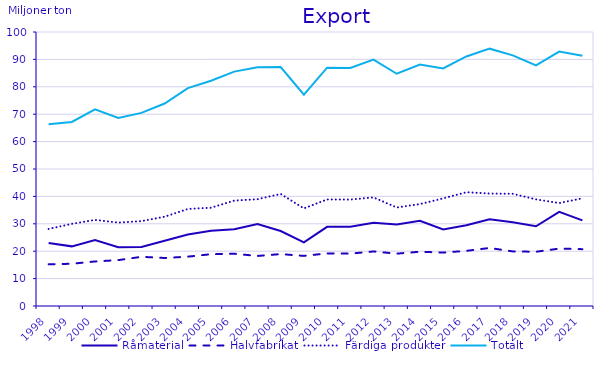
| Category | Råmaterial | Halvfabrikat | Färdiga produkter | Totalt |
|---|---|---|---|---|
| 1998.0 | 23.014 | 15.225 | 28.118 | 66.356 |
| 1999.0 | 21.768 | 15.418 | 29.983 | 67.169 |
| 2000.0 | 24.092 | 16.259 | 31.435 | 71.786 |
| 2001.0 | 21.458 | 16.744 | 30.44 | 68.642 |
| 2002.0 | 21.553 | 17.952 | 30.983 | 70.488 |
| 2003.0 | 23.794 | 17.523 | 32.59 | 73.906 |
| 2004.0 | 26.099 | 18.01 | 35.421 | 79.53 |
| 2005.0 | 27.44 | 18.905 | 35.877 | 82.222 |
| 2006.0 | 28.008 | 19.074 | 38.469 | 85.551 |
| 2007.0 | 29.901 | 18.267 | 38.976 | 87.144 |
| 2008.0 | 27.364 | 18.951 | 40.893 | 87.208 |
| 2009.0 | 23.233 | 18.287 | 35.626 | 77.145 |
| 2010.0 | 28.899 | 19.203 | 38.89 | 86.992 |
| 2011.0 | 28.913 | 19.112 | 38.848 | 86.873 |
| 2012.0 | 30.4 | 19.907 | 39.63 | 89.938 |
| 2013.0 | 29.709 | 19.106 | 35.945 | 84.76 |
| 2014.0 | 31.1 | 19.806 | 37.203 | 88.109 |
| 2015.0 | 27.91 | 19.502 | 39.273 | 86.686 |
| 2016.0 | 29.44 | 20.124 | 41.517 | 91.081 |
| 2017.0 | 31.692 | 21.176 | 41.047 | 93.916 |
| 2018.0 | 30.59 | 19.922 | 40.949 | 91.46 |
| 2019.0 | 29.098 | 19.797 | 38.933 | 87.828 |
| 2020.0 | 34.37 | 20.951 | 37.553 | 92.874 |
| 2021.0 | 31.272 | 20.745 | 39.295 | 91.312 |